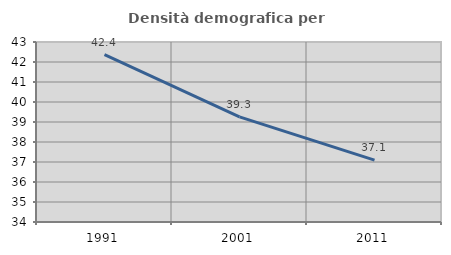
| Category | Densità demografica |
|---|---|
| 1991.0 | 42.365 |
| 2001.0 | 39.254 |
| 2011.0 | 37.093 |